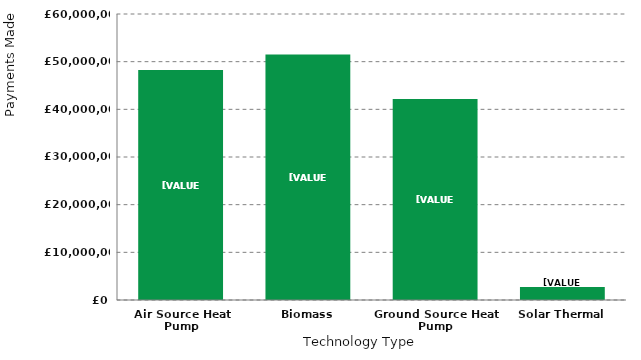
| Category | Series 0 |
|---|---|
| Air Source Heat Pump | 48230207.01 |
| Biomass | 51511717.42 |
| Ground Source Heat Pump | 42178116.31 |
| Solar Thermal | 2709712.77 |